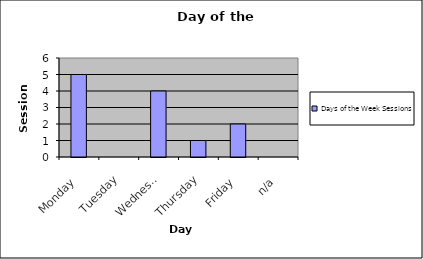
| Category | Days of the Week |
|---|---|
| Monday | 5 |
| Tuesday | 0 |
| Wednesday | 4 |
| Thursday | 1 |
| Friday | 2 |
| n/a | 0 |